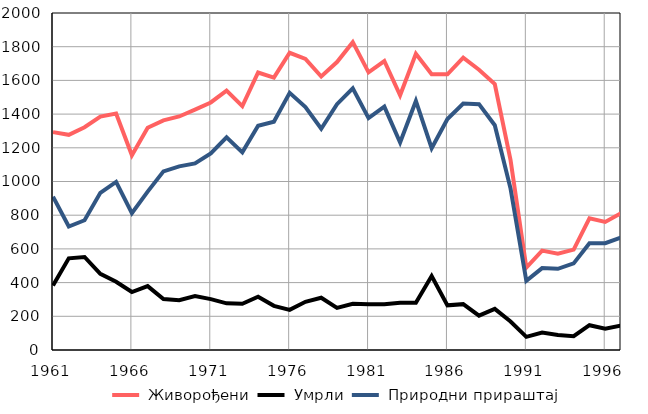
| Category |  Живорођени |  Умрли |  Природни прираштај |
|---|---|---|---|
| 1961.0 | 1293 | 383 | 910 |
| 1962.0 | 1277 | 544 | 733 |
| 1963.0 | 1322 | 552 | 770 |
| 1964.0 | 1385 | 452 | 933 |
| 1965.0 | 1403 | 405 | 998 |
| 1966.0 | 1156 | 344 | 812 |
| 1967.0 | 1319 | 379 | 940 |
| 1968.0 | 1363 | 303 | 1060 |
| 1969.0 | 1386 | 296 | 1090 |
| 1970.0 | 1427 | 320 | 1107 |
| 1971.0 | 1469 | 302 | 1167 |
| 1972.0 | 1539 | 277 | 1262 |
| 1973.0 | 1447 | 274 | 1173 |
| 1974.0 | 1647 | 316 | 1331 |
| 1975.0 | 1617 | 262 | 1355 |
| 1976.0 | 1764 | 238 | 1526 |
| 1977.0 | 1728 | 286 | 1442 |
| 1978.0 | 1623 | 310 | 1313 |
| 1979.0 | 1709 | 250 | 1459 |
| 1980.0 | 1827 | 274 | 1553 |
| 1981.0 | 1648 | 272 | 1376 |
| 1982.0 | 1715 | 271 | 1444 |
| 1983.0 | 1512 | 281 | 1231 |
| 1984.0 | 1758 | 280 | 1478 |
| 1985.0 | 1637 | 439 | 1198 |
| 1986.0 | 1636 | 265 | 1371 |
| 1987.0 | 1735 | 272 | 1463 |
| 1988.0 | 1663 | 204 | 1459 |
| 1989.0 | 1578 | 244 | 1334 |
| 1990.0 | 1127 | 169 | 958 |
| 1991.0 | 489 | 78 | 411 |
| 1992.0 | 590 | 104 | 486 |
| 1993.0 | 571 | 89 | 482 |
| 1994.0 | 596 | 82 | 514 |
| 1995.0 | 781 | 147 | 634 |
| 1996.0 | 760 | 126 | 634 |
| 1997.0 | 812 | 145 | 667 |